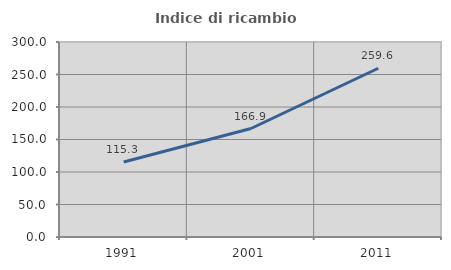
| Category | Indice di ricambio occupazionale  |
|---|---|
| 1991.0 | 115.287 |
| 2001.0 | 166.912 |
| 2011.0 | 259.603 |